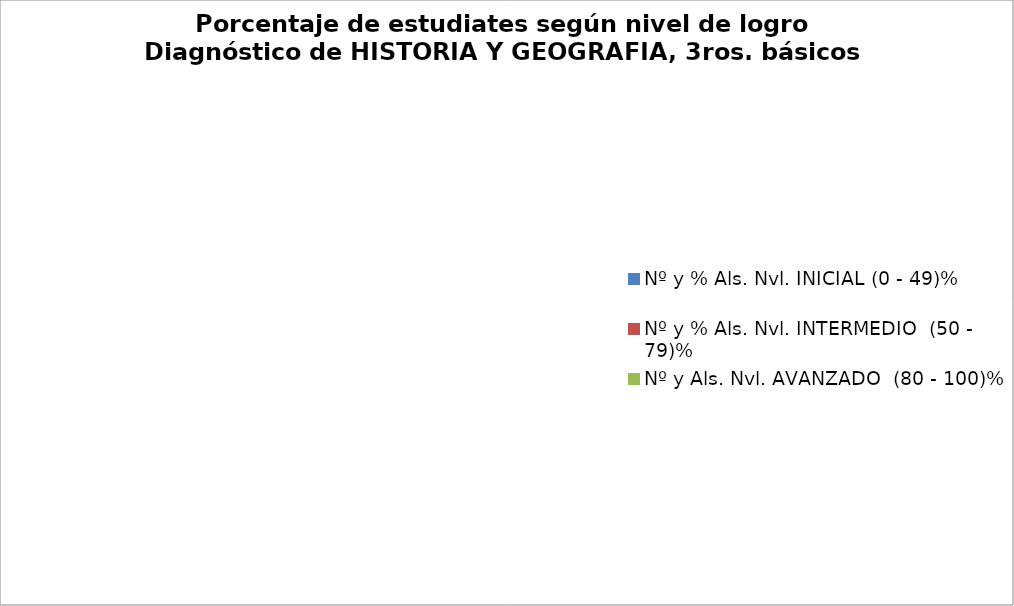
| Category | Series 0 |
|---|---|
| Nº y % Als. Nvl. INICIAL (0 - 49)% | 0 |
| Nº y % Als. Nvl. INTERMEDIO  (50 - 79)% | 0 |
| Nº y Als. Nvl. AVANZADO  (80 - 100)% | 0 |